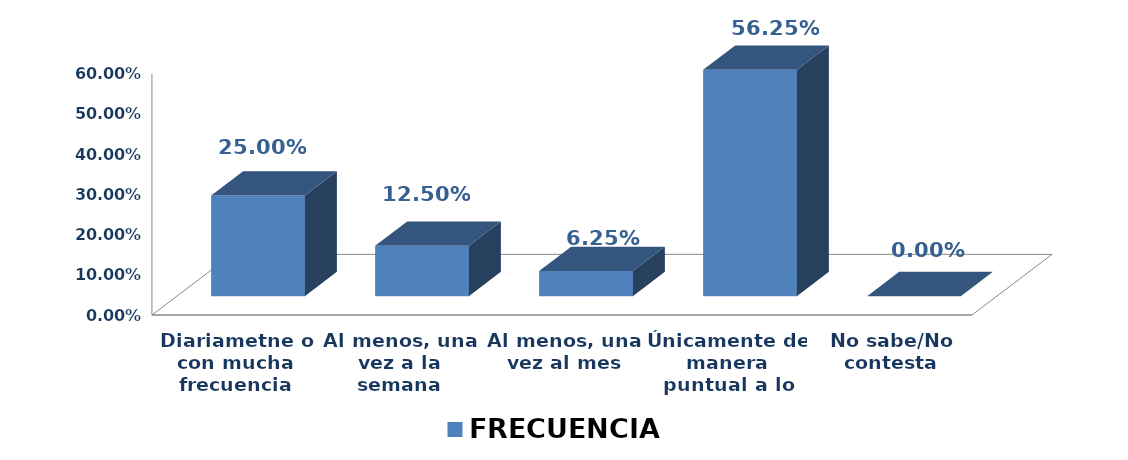
| Category | FRECUENCIA |
|---|---|
| Diariametne o con mucha frecuencia | 0.25 |
| Al menos, una vez a la semana | 0.125 |
| Al menos, una vez al mes | 0.062 |
| Únicamente de manera puntual a lo largo de un año | 0.562 |
| No sabe/No contesta | 0 |